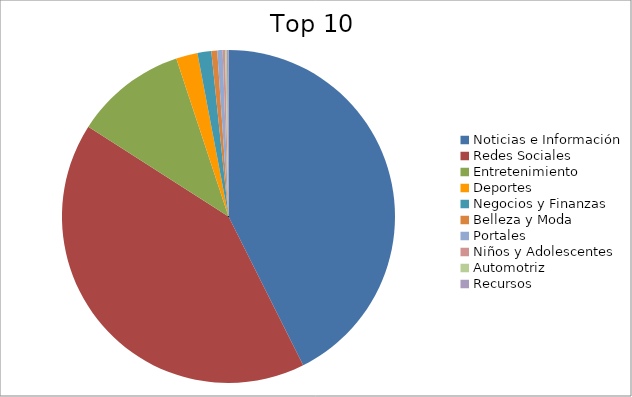
| Category | Series 0 |
|---|---|
| Noticias e Información | 42.55 |
| Redes Sociales | 41.43 |
| Entretenimiento | 10.84 |
| Deportes | 2.08 |
| Negocios y Finanzas | 1.34 |
| Belleza y Moda | 0.57 |
| Portales | 0.52 |
| Niños y Adolescentes | 0.24 |
| Automotriz | 0.16 |
| Recursos | 0.16 |